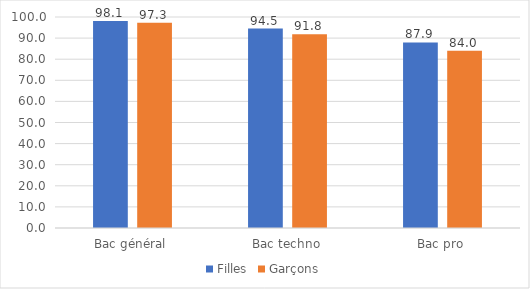
| Category | Filles | Garçons |
|---|---|---|
| Bac général | 98.052 | 97.258 |
| Bac techno | 94.537 | 91.807 |
| Bac pro | 87.943 | 84.009 |